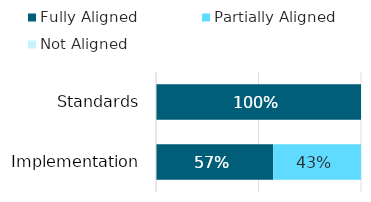
| Category | Fully Aligned | Partially Aligned | Not Aligned |
|---|---|---|---|
| Standards | 1 | 0 | 0 |
| Implementation | 0.571 | 0.429 | 0 |